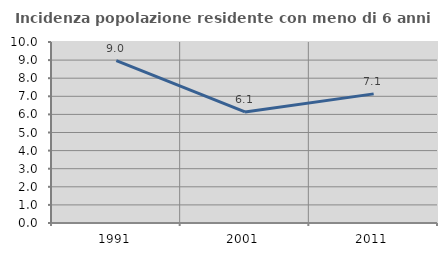
| Category | Incidenza popolazione residente con meno di 6 anni |
|---|---|
| 1991.0 | 8.967 |
| 2001.0 | 6.134 |
| 2011.0 | 7.133 |